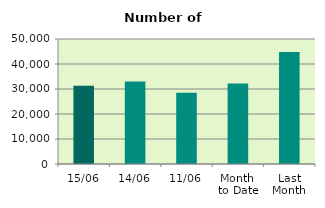
| Category | Series 0 |
|---|---|
| 15/06 | 31326 |
| 14/06 | 33002 |
| 11/06 | 28536 |
| Month 
to Date | 32243.818 |
| Last
Month | 44751.81 |